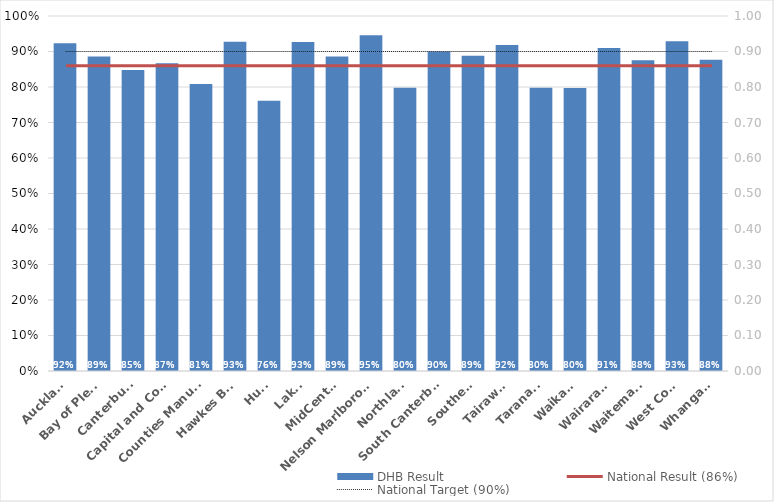
| Category | DHB Result |
|---|---|
| Auckland | 0.923 |
| Bay of Plenty | 0.886 |
| Canterbury | 0.848 |
| Capital and Coast | 0.867 |
| Counties Manukau | 0.809 |
| Hawkes Bay | 0.927 |
| Hutt | 0.762 |
| Lakes | 0.927 |
| MidCentral | 0.886 |
| Nelson Marlborough | 0.946 |
| Northland | 0.798 |
| South Canterbury | 0.9 |
| Southern | 0.888 |
| Tairawhiti | 0.919 |
| Taranaki | 0.798 |
| Waikato | 0.797 |
| Wairarapa | 0.91 |
| Waitemata | 0.875 |
| West Coast | 0.929 |
| Whanganui | 0.877 |